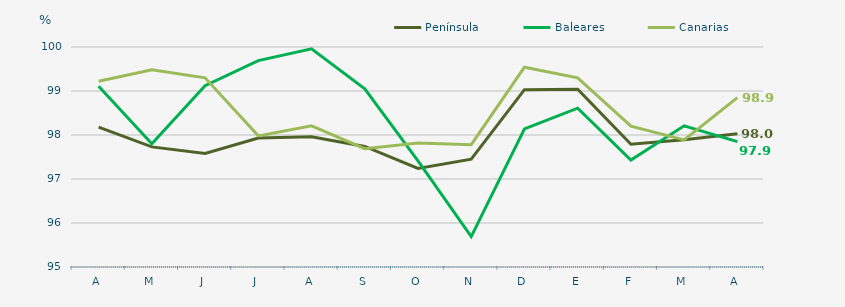
| Category | Península | Baleares | Canarias |
|---|---|---|---|
| A | 98.18 | 99.11 | 99.22 |
| M | 97.73 | 97.8 | 99.48 |
| J | 97.58 | 99.12 | 99.3 |
| J | 97.93 | 99.69 | 97.98 |
| A | 97.96 | 99.96 | 98.21 |
| S | 97.74 | 99.05 | 97.69 |
| O | 97.24 | 97.41 | 97.82 |
| N | 97.45 | 95.69 | 97.78 |
| D | 99.03 | 98.14 | 99.54 |
| E | 99.04 | 98.61 | 99.3 |
| F | 97.79 | 97.43 | 98.2 |
| M | 97.89 | 98.21 | 97.89 |
| A | 98.03 | 97.85 | 98.85 |